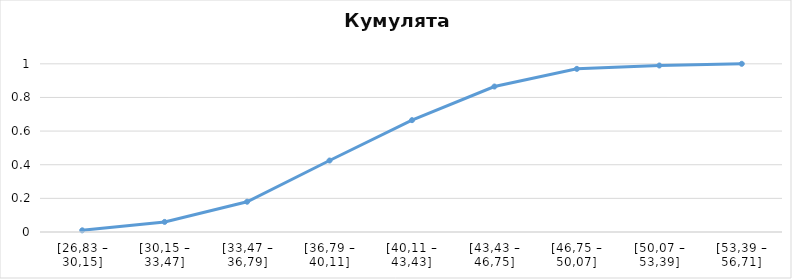
| Category | Series 0 |
|---|---|
| [26,83 – 30,15] | 0.01 |
| [30,15 – 33,47] | 0.06 |
| [33,47 – 36,79] | 0.18 |
| [36,79 – 40,11] | 0.425 |
| [40,11 – 43,43] | 0.665 |
| [43,43 – 46,75] | 0.865 |
| [46,75 – 50,07] | 0.97 |
| [50,07 – 53,39] | 0.99 |
| [53,39 – 56,71] | 1 |